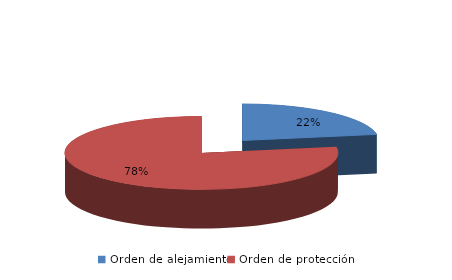
| Category | Series 0 |
|---|---|
| Orden de alejamiento | 63 |
| Orden de protección | 219 |